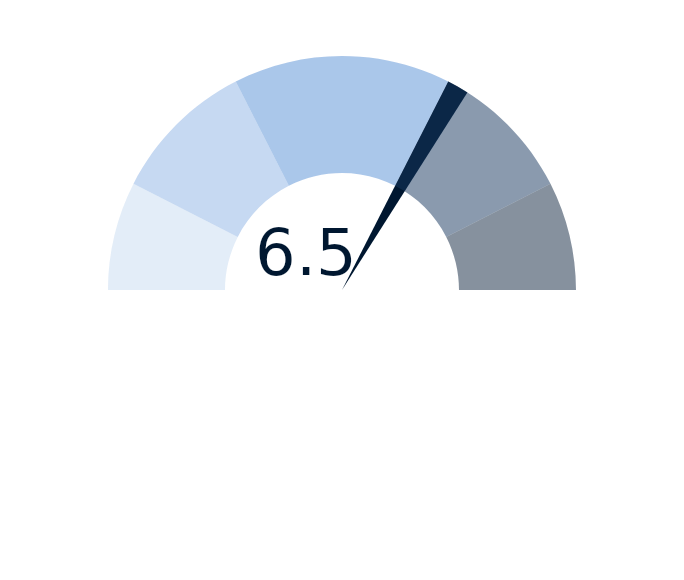
| Category | factor |
|---|---|
| 0 | 6.5 |
| 1 | 0.3 |
| 2 | 13.2 |